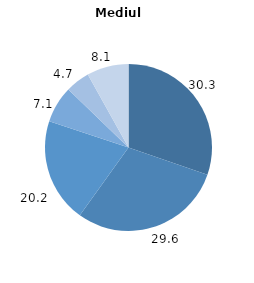
| Category | Mediul rural |
|---|---|
| 0 | 30.3 |
| 1 | 29.6 |
| 2 | 20.2 |
| 3 | 7.1 |
| 4 | 4.7 |
| 5 | 8.1 |